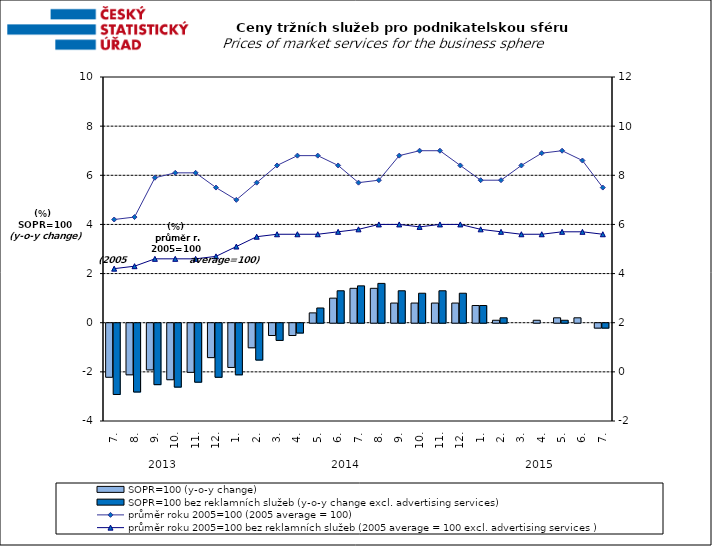
| Category | SOPR=100 (y-o-y change)   | SOPR=100 bez reklamních služeb (y-o-y change excl. advertising services)   |
|---|---|---|
| 0 | -2.2 | -2.9 |
| 1 | -2.1 | -2.8 |
| 2 | -1.9 | -2.5 |
| 3 | -2.3 | -2.6 |
| 4 | -2 | -2.4 |
| 5 | -1.4 | -2.2 |
| 6 | -1.8 | -2.1 |
| 7 | -1 | -1.5 |
| 8 | -0.5 | -0.7 |
| 9 | -0.5 | -0.4 |
| 10 | 0.4 | 0.6 |
| 11 | 1 | 1.3 |
| 12 | 1.4 | 1.5 |
| 13 | 1.4 | 1.6 |
| 14 | 0.8 | 1.3 |
| 15 | 0.8 | 1.2 |
| 16 | 0.8 | 1.3 |
| 17 | 0.8 | 1.2 |
| 18 | 0.7 | 0.7 |
| 19 | 0.1 | 0.2 |
| 20 | 0 | 0 |
| 21 | 0.1 | 0 |
| 22 | 0.2 | 0.1 |
| 23 | 0.2 | 0 |
| 24 | -0.2 | -0.2 |